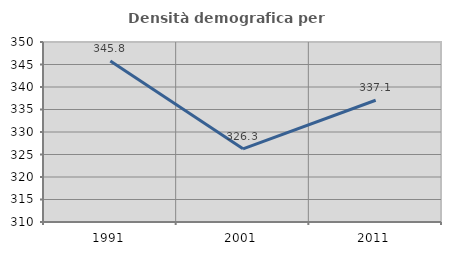
| Category | Densità demografica |
|---|---|
| 1991.0 | 345.775 |
| 2001.0 | 326.259 |
| 2011.0 | 337.05 |